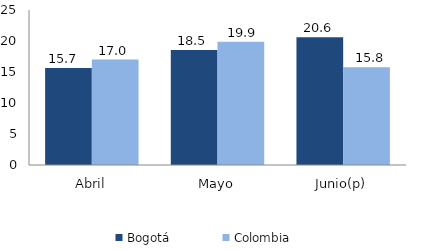
| Category | Bogotá | Colombia |
|---|---|---|
| Abril | 15.657 | 17.011 |
| Mayo | 18.536 | 19.875 |
| Junio(p) | 20.621 | 15.775 |